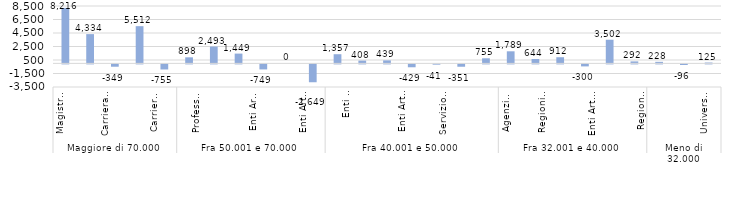
| Category | Series 0 |
|---|---|
| 0 | 8216.253 |
| 1 | 4334.368 |
| 2 | -348.795 |
| 3 | 5511.935 |
| 4 | -754.647 |
| 5 | 897.774 |
| 6 | 2492.926 |
| 7 | 1449.228 |
| 8 | -748.516 |
| 9 | 0 |
| 10 | -2648.637 |
| 11 | 1357.189 |
| 12 | 407.947 |
| 13 | 439.282 |
| 14 | -428.741 |
| 15 | -40.632 |
| 16 | -351.134 |
| 17 | 754.685 |
| 18 | 1788.843 |
| 19 | 644.203 |
| 20 | 912.496 |
| 21 | -300.403 |
| 22 | 3502.147 |
| 23 | 292.175 |
| 24 | 228.299 |
| 25 | -96.458 |
| 26 | 125.437 |